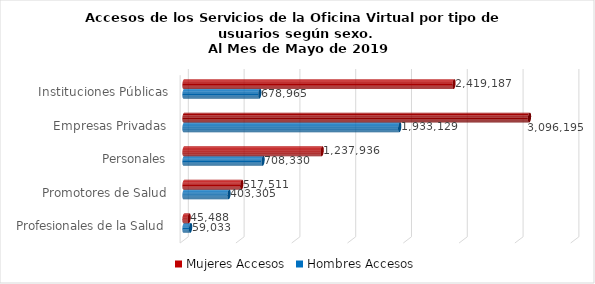
| Category | Mujeres | Hombres |
|---|---|---|
| Instituciones Públicas | 2419187 | 678965 |
| Empresas Privadas | 3096195 | 1933129 |
| Personales | 1237936 | 708330 |
| Promotores de Salud | 517511 | 403305 |
| Profesionales de la Salud | 45488 | 59033 |